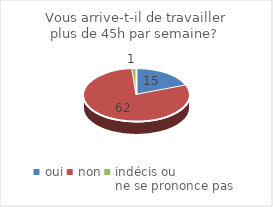
| Category | Vous arrive-t-il de travailler plus de 45h par semaine? |
|---|---|
| oui | 15 |
| non | 62 |
| indécis ou 
ne se prononce pas | 1 |